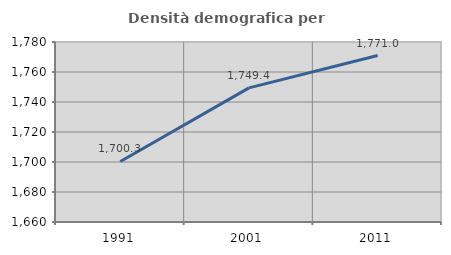
| Category | Densità demografica |
|---|---|
| 1991.0 | 1700.338 |
| 2001.0 | 1749.414 |
| 2011.0 | 1770.953 |